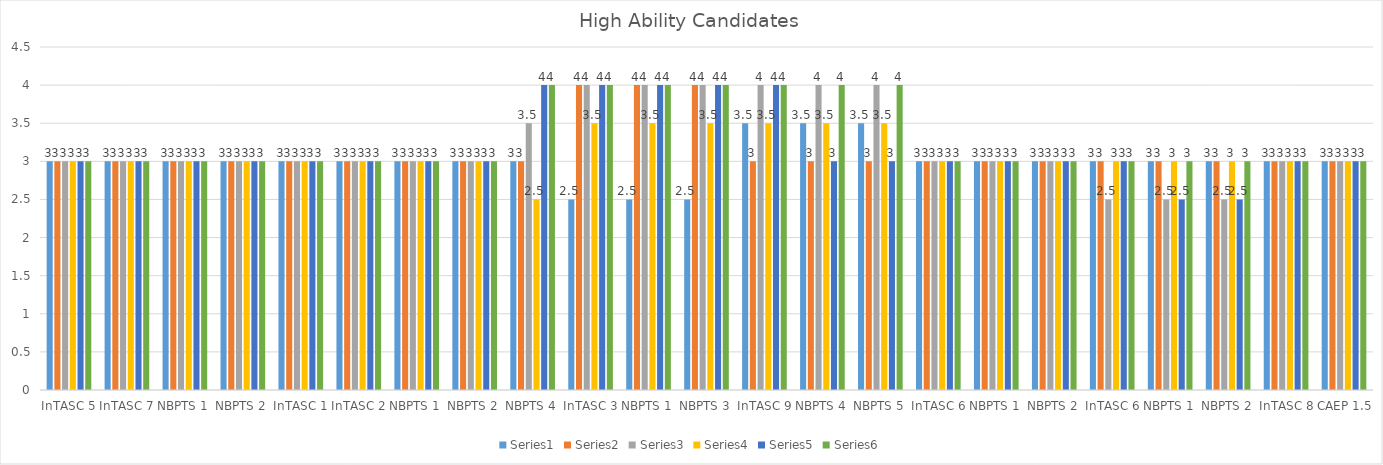
| Category | Series 0 | Series 1 | Series 2 | Series 3 | Series 4 | Series 5 |
|---|---|---|---|---|---|---|
| InTASC 5 | 3 | 3 | 3 | 3 | 3 | 3 |
| InTASC 7 | 3 | 3 | 3 | 3 | 3 | 3 |
| NBPTS 1 | 3 | 3 | 3 | 3 | 3 | 3 |
| NBPTS 2 | 3 | 3 | 3 | 3 | 3 | 3 |
| InTASC 1 | 3 | 3 | 3 | 3 | 3 | 3 |
| InTASC 2 | 3 | 3 | 3 | 3 | 3 | 3 |
| NBPTS 1 | 3 | 3 | 3 | 3 | 3 | 3 |
| NBPTS 2 | 3 | 3 | 3 | 3 | 3 | 3 |
| NBPTS 4 | 3 | 3 | 3.5 | 2.5 | 4 | 4 |
| InTASC 3 | 2.5 | 4 | 4 | 3.5 | 4 | 4 |
| NBPTS 1 | 2.5 | 4 | 4 | 3.5 | 4 | 4 |
| NBPTS 3 | 2.5 | 4 | 4 | 3.5 | 4 | 4 |
| InTASC 9 | 3.5 | 3 | 4 | 3.5 | 4 | 4 |
| NBPTS 4 | 3.5 | 3 | 4 | 3.5 | 3 | 4 |
| NBPTS 5 | 3.5 | 3 | 4 | 3.5 | 3 | 4 |
| InTASC 6 | 3 | 3 | 3 | 3 | 3 | 3 |
| NBPTS 1 | 3 | 3 | 3 | 3 | 3 | 3 |
| NBPTS 2 | 3 | 3 | 3 | 3 | 3 | 3 |
| InTASC 6 | 3 | 3 | 2.5 | 3 | 3 | 3 |
| NBPTS 1 | 3 | 3 | 2.5 | 3 | 2.5 | 3 |
| NBPTS 2 | 3 | 3 | 2.5 | 3 | 2.5 | 3 |
| InTASC 8 | 3 | 3 | 3 | 3 | 3 | 3 |
| CAEP 1.5 | 3 | 3 | 3 | 3 | 3 | 3 |